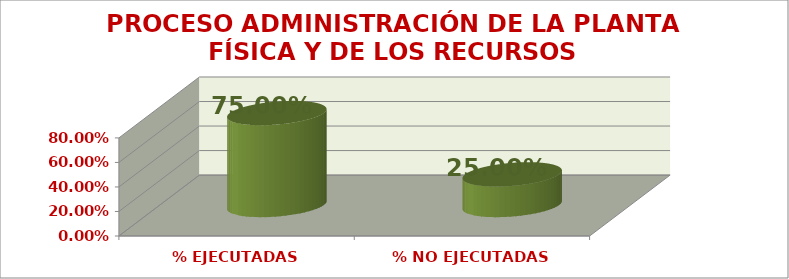
| Category | PROCESO ADMINISTRACIÓN DE LA PLANTA FÍSICA Y DE LOS RECURSOS |
|---|---|
| % EJECUTADAS | 0.75 |
| % NO EJECUTADAS | 0.25 |